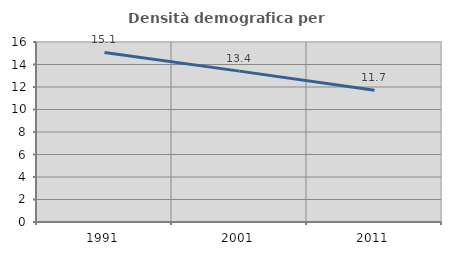
| Category | Densità demografica |
|---|---|
| 1991.0 | 15.071 |
| 2001.0 | 13.411 |
| 2011.0 | 11.708 |